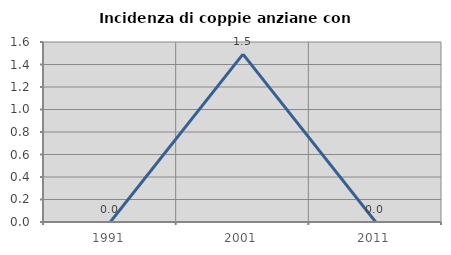
| Category | Incidenza di coppie anziane con figli |
|---|---|
| 1991.0 | 0 |
| 2001.0 | 1.493 |
| 2011.0 | 0 |